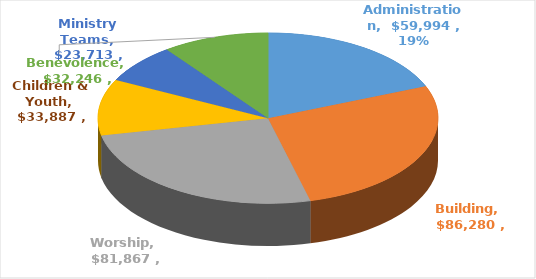
| Category | Series 0 |
|---|---|
| Administration | 59993.514 |
| Building | 86280.257 |
| Worship | 81866.637 |
| Children & Youth | 33887.398 |
| Ministry Teams | 23712.514 |
| Benevolence | 32246 |